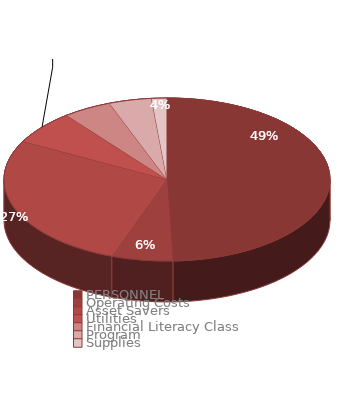
| Category | $165,000.00  |
|---|---|
| PERSONNEL | 81560 |
| Operating Costs  | 10000 |
| Asset Savers | 45000 |
| Utilities  | 11000 |
| Financial Literacy Class | 7940 |
| Program | 7000 |
| Supplies | 2500 |